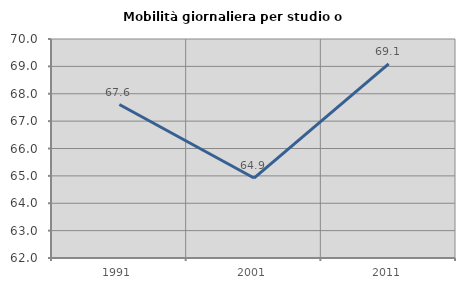
| Category | Mobilità giornaliera per studio o lavoro |
|---|---|
| 1991.0 | 67.607 |
| 2001.0 | 64.921 |
| 2011.0 | 69.092 |